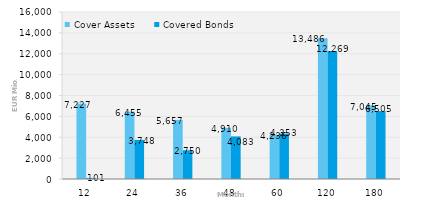
| Category | Cover Assets | Covered Bonds |
|---|---|---|
| 12.0 | 7227.275 | 101 |
| 24.0 | 6455.268 | 3747.622 |
| 36.0 | 5656.898 | 2750 |
| 48.0 | 4909.659 | 4082.5 |
| 60.0 | 4236.21 | 4353.275 |
| 120.0 | 13485.538 | 12268.84 |
| 180.0 | 7045.33 | 6505 |